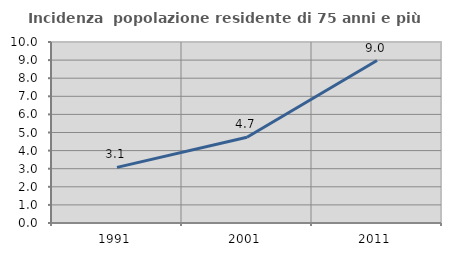
| Category | Incidenza  popolazione residente di 75 anni e più |
|---|---|
| 1991.0 | 3.074 |
| 2001.0 | 4.735 |
| 2011.0 | 8.977 |